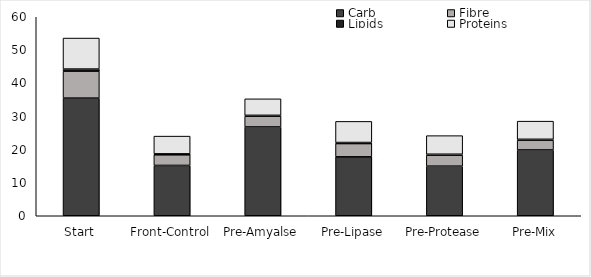
| Category | Carb  | Fibre  | Lipids  | Proteins |
|---|---|---|---|---|
| Start | 35.472 | 8.128 | 0.63 | 9.346 |
| Front-Control | 15.176 | 3.198 | 0.288 | 5.35 |
| Pre-Amyalse | 26.78 | 3.222 | 0.271 | 4.982 |
| Pre-Lipase | 17.77 | 3.995 | 0.319 | 6.371 |
| Pre-Protease | 14.957 | 3.294 | 0.299 | 5.603 |
| Pre-Mix | 19.844 | 2.946 | 0.262 | 5.471 |